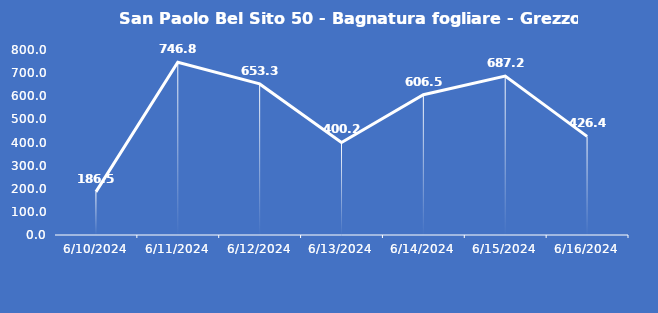
| Category | San Paolo Bel Sito 50 - Bagnatura fogliare - Grezzo (min) |
|---|---|
| 6/10/24 | 186.5 |
| 6/11/24 | 746.8 |
| 6/12/24 | 653.3 |
| 6/13/24 | 400.2 |
| 6/14/24 | 606.5 |
| 6/15/24 | 687.2 |
| 6/16/24 | 426.4 |